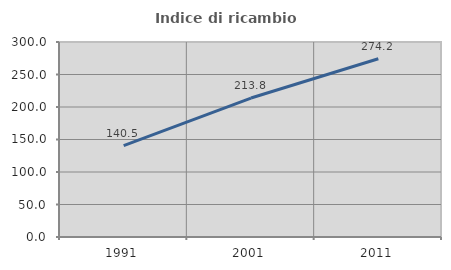
| Category | Indice di ricambio occupazionale  |
|---|---|
| 1991.0 | 140.541 |
| 2001.0 | 213.793 |
| 2011.0 | 274.194 |